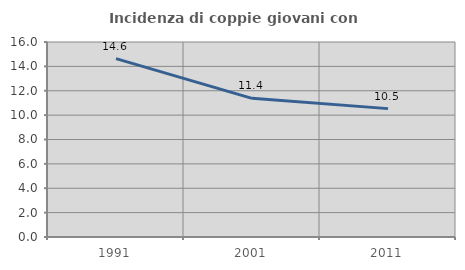
| Category | Incidenza di coppie giovani con figli |
|---|---|
| 1991.0 | 14.638 |
| 2001.0 | 11.378 |
| 2011.0 | 10.533 |